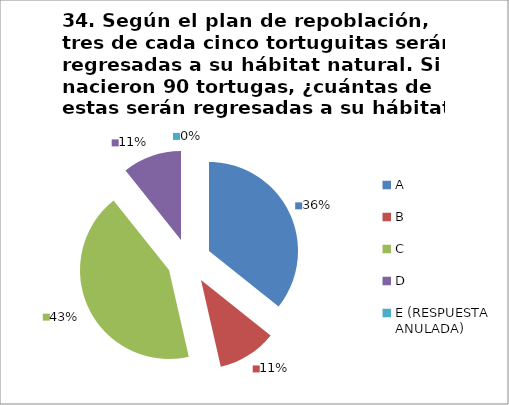
| Category | CANTIDAD DE RESPUESTAS PREGUNTA (34) | PORCENTAJE |
|---|---|---|
| A | 10 | 0.357 |
| B | 3 | 0.107 |
| C | 12 | 0.429 |
| D | 3 | 0.107 |
| E (RESPUESTA ANULADA) | 0 | 0 |